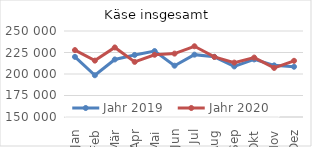
| Category | Jahr 2019 | Jahr 2020 |
|---|---|---|
| Jan | 219937.91 | 227798.364 |
| Feb | 198539.34 | 215559.816 |
| Mär | 216900.825 | 230873.888 |
| Apr | 222165.991 | 214092.69 |
| Mai | 226678.674 | 222353.242 |
| Jun | 209664.665 | 223708.578 |
| Jul | 222500.384 | 232239.859 |
| Aug | 219956.596 | 219854.87 |
| Sep | 208802.187 | 213265.977 |
| Okt | 216941.01 | 219115.237 |
| Nov | 210033.927 | 207069.807 |
| Dez | 208443.254 | 215337.87 |